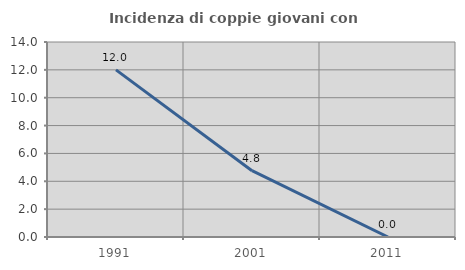
| Category | Incidenza di coppie giovani con figli |
|---|---|
| 1991.0 | 12 |
| 2001.0 | 4.762 |
| 2011.0 | 0 |